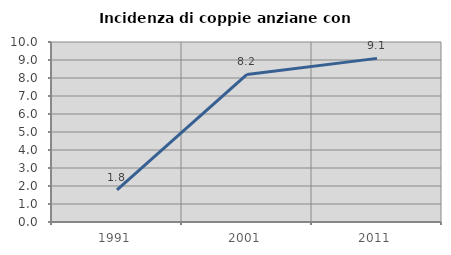
| Category | Incidenza di coppie anziane con figli |
|---|---|
| 1991.0 | 1.786 |
| 2001.0 | 8.197 |
| 2011.0 | 9.091 |